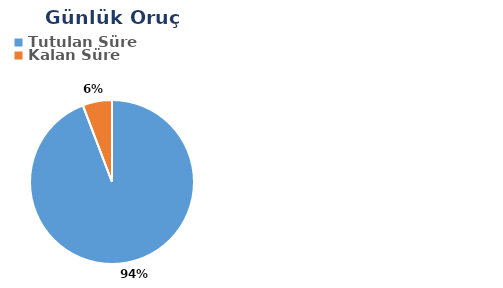
| Category | Günlük |
|---|---|
| Tutulan Süre | 0.551 |
| Kalan Süre | 0.034 |